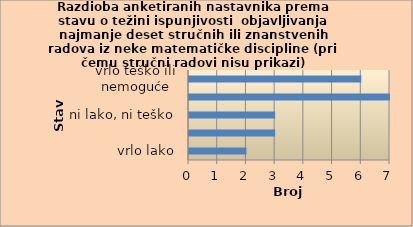
| Category | Series 0 |
|---|---|
| vrlo lako | 2 |
| lako | 3 |
| ni lako, ni teško | 3 |
| teško | 7 |
| vrlo teško ili nemoguće | 6 |